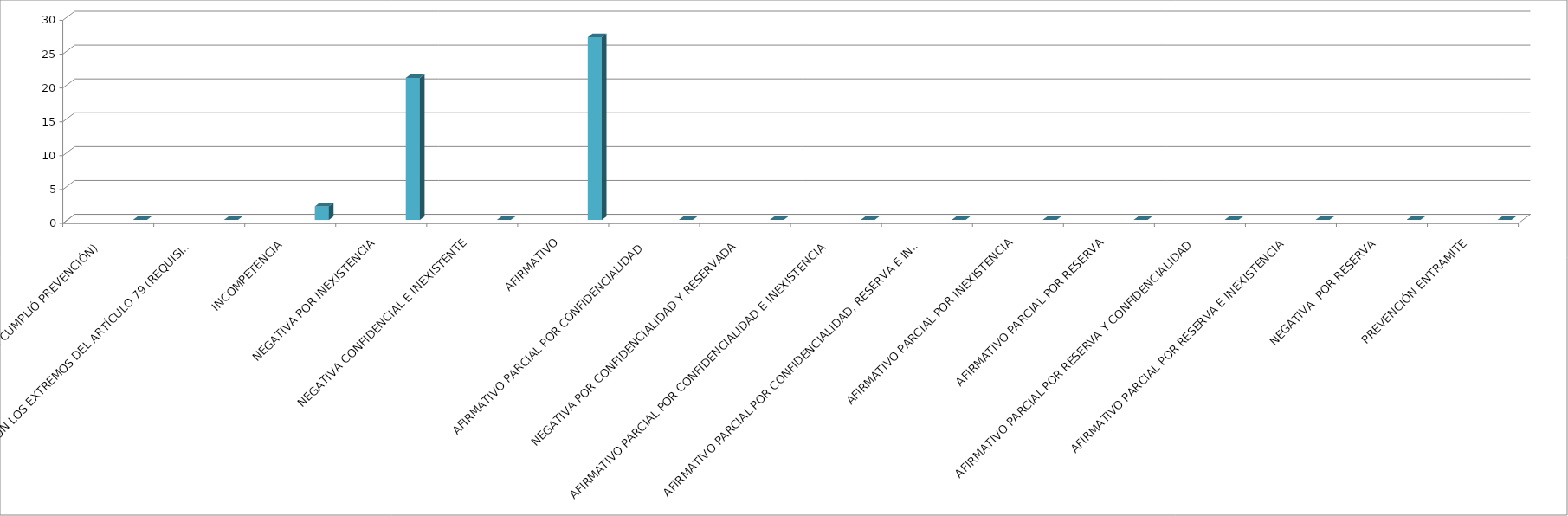
| Category | Series 0 | Series 1 | Series 2 | Series 3 | Series 4 |
|---|---|---|---|---|---|
| SE TIENE POR NO PRESENTADA ( NO CUMPLIÓ PREVENCIÓN) |  |  |  |  | 0 |
| NO CUMPLIO CON LOS EXTREMOS DEL ARTÍCULO 79 (REQUISITOS) |  |  |  |  | 0 |
| INCOMPETENCIA  |  |  |  |  | 2 |
| NEGATIVA POR INEXISTENCIA |  |  |  |  | 21 |
| NEGATIVA CONFIDENCIAL E INEXISTENTE |  |  |  |  | 0 |
| AFIRMATIVO |  |  |  |  | 27 |
| AFIRMATIVO PARCIAL POR CONFIDENCIALIDAD  |  |  |  |  | 0 |
| NEGATIVA POR CONFIDENCIALIDAD Y RESERVADA |  |  |  |  | 0 |
| AFIRMATIVO PARCIAL POR CONFIDENCIALIDAD E INEXISTENCIA |  |  |  |  | 0 |
| AFIRMATIVO PARCIAL POR CONFIDENCIALIDAD, RESERVA E INEXISTENCIA |  |  |  |  | 0 |
| AFIRMATIVO PARCIAL POR INEXISTENCIA |  |  |  |  | 0 |
| AFIRMATIVO PARCIAL POR RESERVA |  |  |  |  | 0 |
| AFIRMATIVO PARCIAL POR RESERVA Y CONFIDENCIALIDAD |  |  |  |  | 0 |
| AFIRMATIVO PARCIAL POR RESERVA E INEXISTENCIA |  |  |  |  | 0 |
| NEGATIVA  POR RESERVA |  |  |  |  | 0 |
| PREVENCIÓN ENTRAMITE |  |  |  |  | 0 |